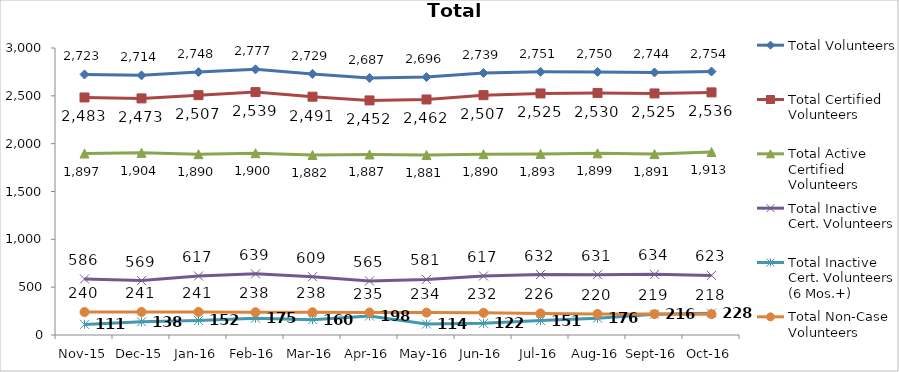
| Category | Total Volunteers | Total Certified Volunteers | Total Active Certified Volunteers | Total Inactive Cert. Volunteers | Total Inactive Cert. Volunteers (6 Mos.+) | Total Non-Case Volunteers |
|---|---|---|---|---|---|---|
| Nov-15 | 2723 | 2483 | 1897 | 586 | 111 | 240 |
| Dec-15 | 2714 | 2473 | 1904 | 569 | 138 | 241 |
| Jan-16 | 2748 | 2507 | 1890 | 617 | 152 | 241 |
| Feb-16 | 2777 | 2539 | 1900 | 639 | 175 | 238 |
| Mar-16 | 2729 | 2491 | 1882 | 609 | 160 | 238 |
| Apr-16 | 2687 | 2452 | 1887 | 565 | 198 | 235 |
| May-16 | 2696 | 2462 | 1881 | 581 | 114 | 234 |
| Jun-16 | 2739 | 2507 | 1890 | 617 | 122 | 232 |
| Jul-16 | 2751 | 2525 | 1893 | 632 | 151 | 226 |
| Aug-16 | 2750 | 2530 | 1899 | 631 | 176 | 220 |
| Sep-16 | 2744 | 2525 | 1891 | 634 | 216 | 219 |
| Oct-16 | 2754 | 2536 | 1913 | 623 | 228 | 218 |